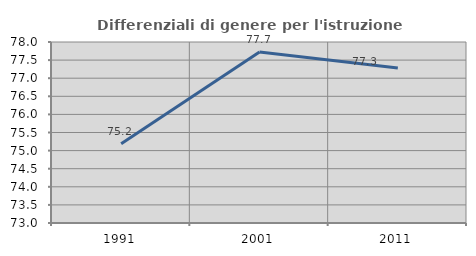
| Category | Differenziali di genere per l'istruzione superiore |
|---|---|
| 1991.0 | 75.186 |
| 2001.0 | 77.726 |
| 2011.0 | 77.281 |